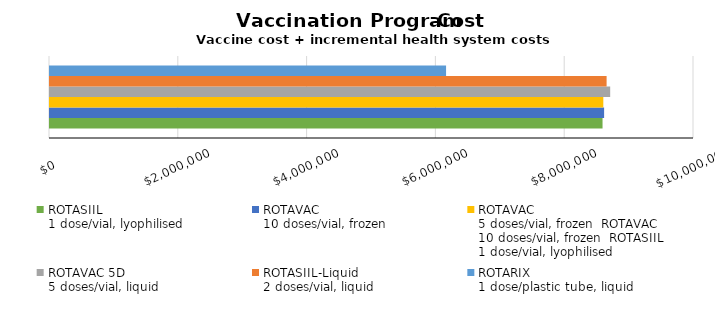
| Category | ROTASIIL
1 dose/vial, lyophilised | ROTAVAC 
10 doses/vial, frozen | ROTAVAC
5 doses/vial, frozen ROTAVAC 
10 doses/vial, frozen ROTASIIL
1 dose/vial, lyophilised | ROTAVAC 5D
5 doses/vial, liquid | ROTASIIL-Liquid
2 doses/vial, liquid | ROTARIX
1 dose/plastic tube, liquid |
|---|---|---|---|---|---|---|
| Total
for 5 years | 8579811.359 | 8604216.329 | 8591885.397 | 8698470.008 | 8642835.183 | 6150141.958 |